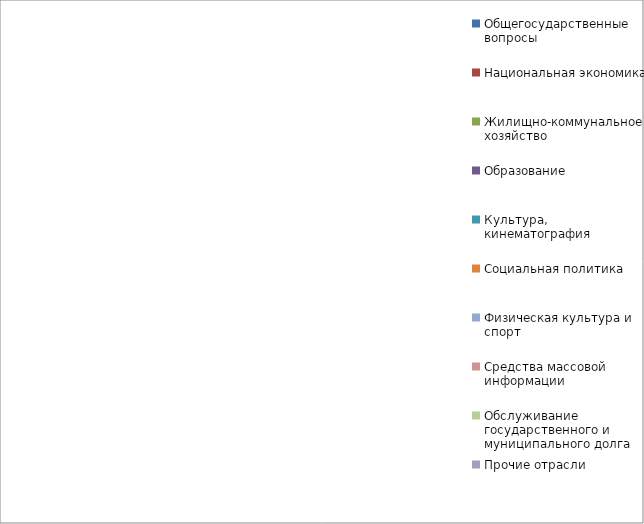
| Category | Series 0 |
|---|---|
| Общегосударственные вопросы | 0 |
| Национальная экономика | 0 |
| Жилищно-коммунальное хозяйство | 0 |
| Образование | 0 |
| Культура, кинематография | 0 |
| Социальная политика | 0 |
| Физическая культура и спорт | 0 |
| Средства массовой информации | 0 |
| Обслуживание государственного и муниципального долга | 0 |
| Прочие отрасли | 0 |